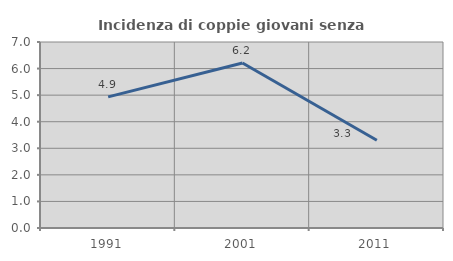
| Category | Incidenza di coppie giovani senza figli |
|---|---|
| 1991.0 | 4.936 |
| 2001.0 | 6.211 |
| 2011.0 | 3.305 |